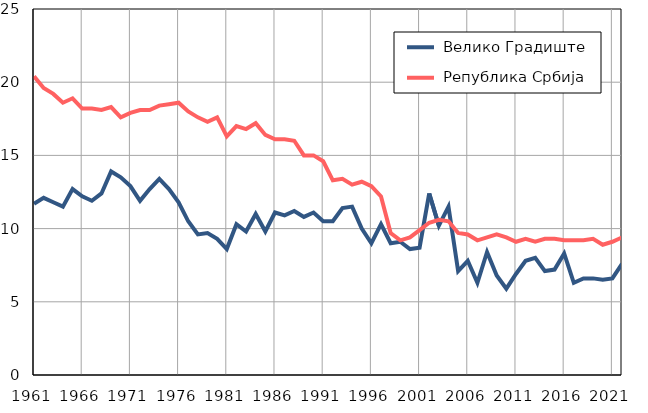
| Category |  Велико Градиште |  Република Србија |
|---|---|---|
| 1961.0 | 11.7 | 20.4 |
| 1962.0 | 12.1 | 19.6 |
| 1963.0 | 11.8 | 19.2 |
| 1964.0 | 11.5 | 18.6 |
| 1965.0 | 12.7 | 18.9 |
| 1966.0 | 12.2 | 18.2 |
| 1967.0 | 11.9 | 18.2 |
| 1968.0 | 12.4 | 18.1 |
| 1969.0 | 13.9 | 18.3 |
| 1970.0 | 13.5 | 17.6 |
| 1971.0 | 12.9 | 17.9 |
| 1972.0 | 11.9 | 18.1 |
| 1973.0 | 12.7 | 18.1 |
| 1974.0 | 13.4 | 18.4 |
| 1975.0 | 12.7 | 18.5 |
| 1976.0 | 11.8 | 18.6 |
| 1977.0 | 10.5 | 18 |
| 1978.0 | 9.6 | 17.6 |
| 1979.0 | 9.7 | 17.3 |
| 1980.0 | 9.3 | 17.6 |
| 1981.0 | 8.6 | 16.3 |
| 1982.0 | 10.3 | 17 |
| 1983.0 | 9.8 | 16.8 |
| 1984.0 | 11 | 17.2 |
| 1985.0 | 9.8 | 16.4 |
| 1986.0 | 11.1 | 16.1 |
| 1987.0 | 10.9 | 16.1 |
| 1988.0 | 11.2 | 16 |
| 1989.0 | 10.8 | 15 |
| 1990.0 | 11.1 | 15 |
| 1991.0 | 10.5 | 14.6 |
| 1992.0 | 10.5 | 13.3 |
| 1993.0 | 11.4 | 13.4 |
| 1994.0 | 11.5 | 13 |
| 1995.0 | 10 | 13.2 |
| 1996.0 | 9 | 12.9 |
| 1997.0 | 10.3 | 12.2 |
| 1998.0 | 9 | 9.7 |
| 1999.0 | 9.1 | 9.2 |
| 2000.0 | 8.6 | 9.4 |
| 2001.0 | 8.7 | 9.9 |
| 2002.0 | 12.4 | 10.4 |
| 2003.0 | 10.2 | 10.6 |
| 2004.0 | 11.5 | 10.5 |
| 2005.0 | 7.1 | 9.7 |
| 2006.0 | 7.8 | 9.6 |
| 2007.0 | 6.3 | 9.2 |
| 2008.0 | 8.4 | 9.4 |
| 2009.0 | 6.8 | 9.6 |
| 2010.0 | 5.9 | 9.4 |
| 2011.0 | 6.9 | 9.1 |
| 2012.0 | 7.8 | 9.3 |
| 2013.0 | 8 | 9.1 |
| 2014.0 | 7.1 | 9.3 |
| 2015.0 | 7.2 | 9.3 |
| 2016.0 | 8.3 | 9.2 |
| 2017.0 | 6.3 | 9.2 |
| 2018.0 | 6.6 | 9.2 |
| 2019.0 | 6.6 | 9.3 |
| 2020.0 | 6.5 | 8.9 |
| 2021.0 | 6.6 | 9.1 |
| 2022.0 | 7.6 | 9.4 |